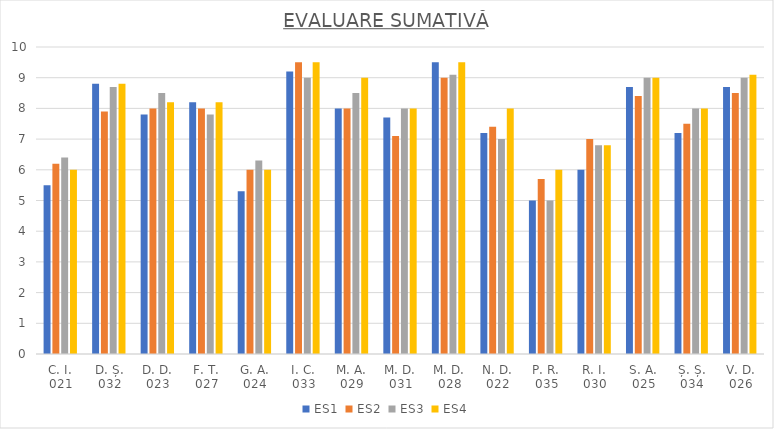
| Category | ES1 | ES2 | ES3 | ES4 |
|---|---|---|---|---|
| C. I. 021 | 5.5 | 6.2 | 6.4 | 6 |
| D. Ș. 032 | 8.8 | 7.9 | 8.7 | 8.8 |
| D. D. 023 | 7.8 | 8 | 8.5 | 8.2 |
| F. T. 027 | 8.2 | 8 | 7.8 | 8.2 |
| G. A. 024 | 5.3 | 6 | 6.3 | 6 |
| I. C. 033 | 9.2 | 9.5 | 9 | 9.5 |
| M. A. 029 | 8 | 8 | 8.5 | 9 |
| M. D. 031 | 7.7 | 7.1 | 8 | 8 |
| M. D. 028 | 9.5 | 9 | 9.1 | 9.5 |
| N. D. 022 | 7.2 | 7.4 | 7 | 8 |
| P. R. 035 | 5 | 5.7 | 5 | 6 |
| R. I. 030 | 6 | 7 | 6.8 | 6.8 |
| S. A. 025 | 8.7 | 8.4 | 9 | 9 |
| Ș. Ș. 034 | 7.2 | 7.5 | 8 | 8 |
| V. D. 026 | 8.7 | 8.5 | 9 | 9.1 |